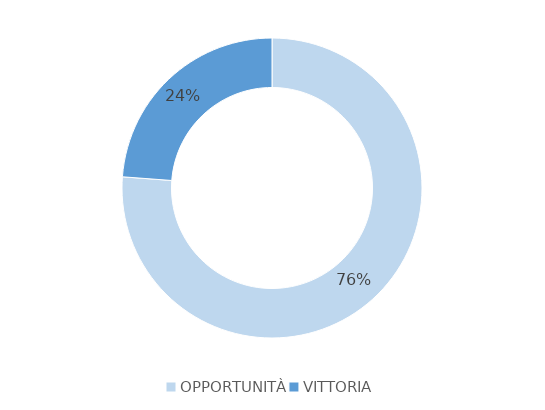
| Category | Series 0 |
|---|---|
| OPPORTUNITÀ | 16 |
| VITTORIA | 5 |